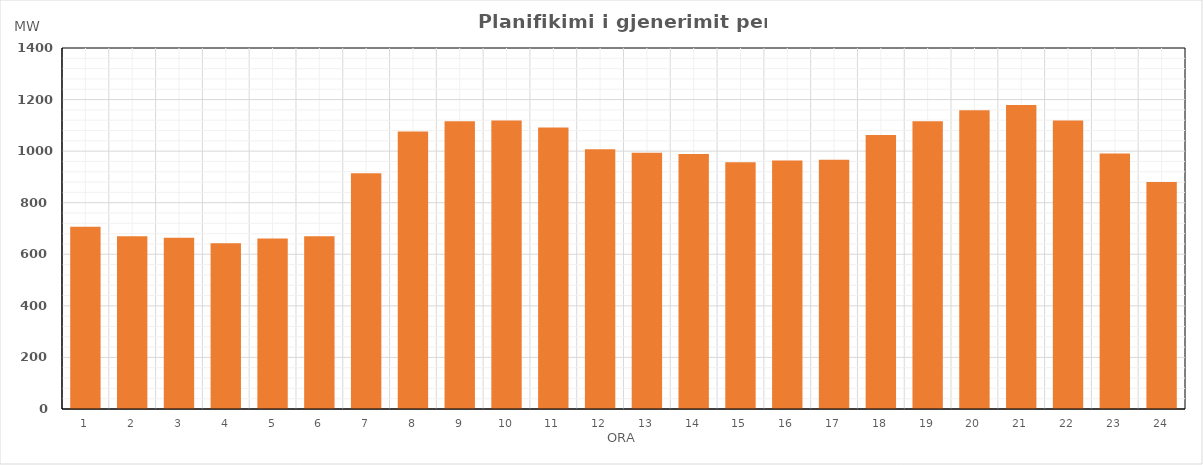
| Category | Max (MW) |
|---|---|
| 0 | 706.77 |
| 1 | 669.79 |
| 2 | 663.75 |
| 3 | 642.74 |
| 4 | 661.66 |
| 5 | 669.55 |
| 6 | 914.45 |
| 7 | 1076.38 |
| 8 | 1116.4 |
| 9 | 1118.7 |
| 10 | 1091.73 |
| 11 | 1007.71 |
| 12 | 993.65 |
| 13 | 988.69 |
| 14 | 956.51 |
| 15 | 963.53 |
| 16 | 966.96 |
| 17 | 1062.94 |
| 18 | 1116 |
| 19 | 1159.01 |
| 20 | 1178.52 |
| 21 | 1118.52 |
| 22 | 990.58 |
| 23 | 880.56 |